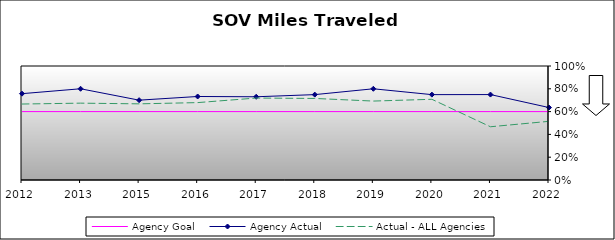
| Category | Agency Goal | Agency Actual | Actual - ALL Agencies |
|---|---|---|---|
| 2012.0 | 0.6 | 0.757 | 0.666 |
| 2013.0 | 0.6 | 0.8 | 0.674 |
| 2015.0 | 0.6 | 0.7 | 0.668 |
| 2016.0 | 0.6 | 0.732 | 0.679 |
| 2017.0 | 0.6 | 0.73 | 0.719 |
| 2018.0 | 0.6 | 0.749 | 0.715 |
| 2019.0 | 0.6 | 0.8 | 0.692 |
| 2020.0 | 0.6 | 0.749 | 0.708 |
| 2021.0 | 0.6 | 0.749 | 0.467 |
| 2022.0 | 0.6 | 0.636 | 0.515 |